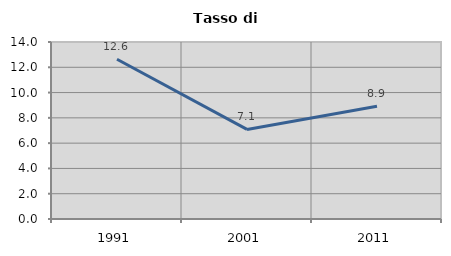
| Category | Tasso di disoccupazione   |
|---|---|
| 1991.0 | 12.639 |
| 2001.0 | 7.087 |
| 2011.0 | 8.917 |